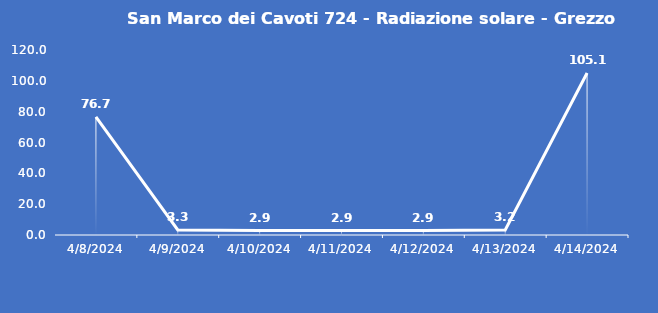
| Category | San Marco dei Cavoti 724 - Radiazione solare - Grezzo (W/m2) |
|---|---|
| 4/8/24 | 76.7 |
| 4/9/24 | 3.3 |
| 4/10/24 | 2.9 |
| 4/11/24 | 2.9 |
| 4/12/24 | 2.9 |
| 4/13/24 | 3.2 |
| 4/14/24 | 105.1 |